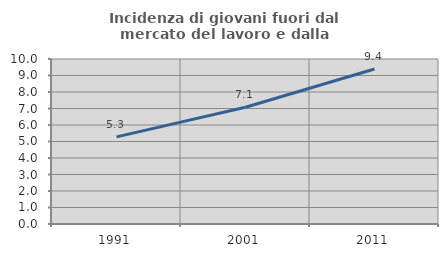
| Category | Incidenza di giovani fuori dal mercato del lavoro e dalla formazione  |
|---|---|
| 1991.0 | 5.28 |
| 2001.0 | 7.077 |
| 2011.0 | 9.391 |